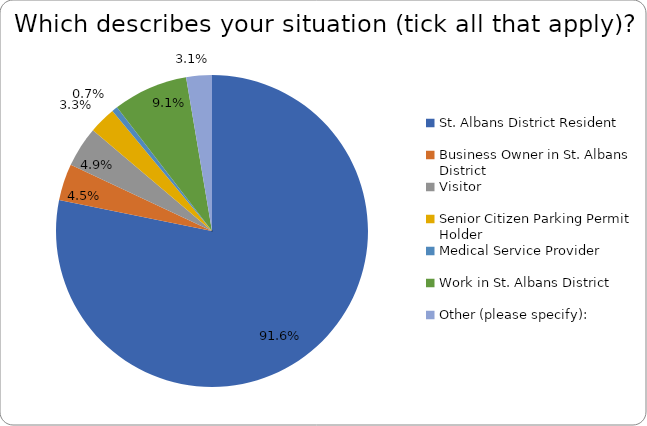
| Category | Series 0 |
|---|---|
| St. Albans District Resident | 0.916 |
| Business Owner in St. Albans District | 0.045 |
| Visitor | 0.049 |
| Senior Citizen Parking Permit Holder | 0.033 |
| Medical Service Provider | 0.007 |
| Work in St. Albans District | 0.091 |
| Other (please specify): | 0.031 |